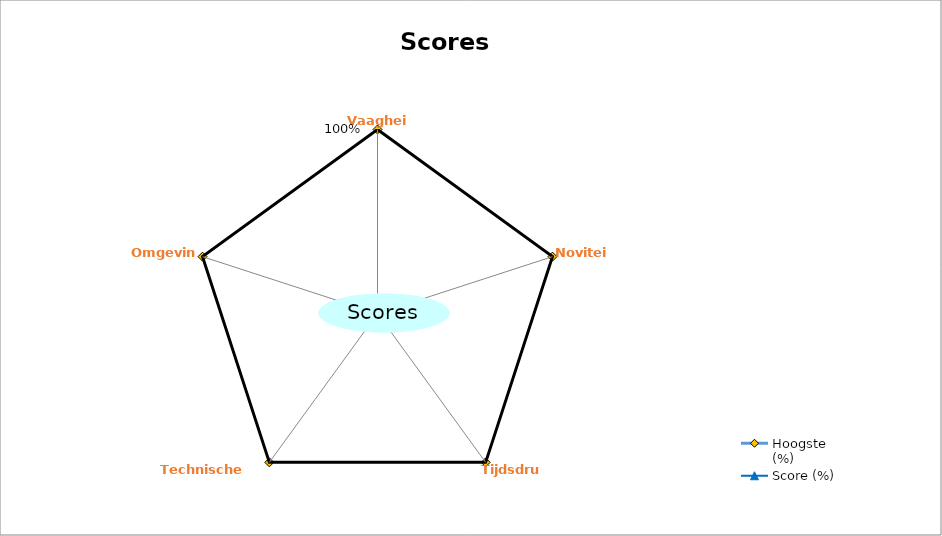
| Category | Hoogste (%) | Score (%) |
|---|---|---|
| Vaagheid | 1 | 0 |
| Noviteit | 1 | 0 |
| Tijdsdruk | 1 | 0 |
| Technische onzekerheid | 1 | 0 |
| Omgeving | 1 | 0 |